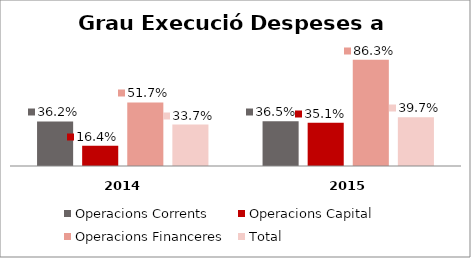
| Category | Operacions Corrents | Operacions Capital | Operacions Financeres | Total |
|---|---|---|---|---|
| 0 | 0.362 | 0.164 | 0.517 | 0.337 |
| 1 | 0.365 | 0.351 | 0.863 | 0.397 |